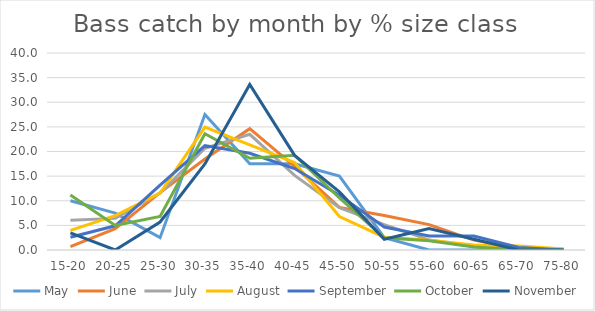
| Category | May | June | July | August | September | October | November |
|---|---|---|---|---|---|---|---|
| 15-20 | 10 | 0.666 | 6.033 | 3.992 | 2.584 | 11.18 | 3.493 |
| 20-25 | 7.5 | 4.326 | 6.418 | 6.986 | 4.91 | 4.969 | 0 |
| 25-30 | 2.5 | 11.647 | 11.553 | 11.577 | 13.178 | 6.832 | 5.677 |
| 30-35 | 27.5 | 18.469 | 20.668 | 24.95 | 21.189 | 23.602 | 17.467 |
| 35-40 | 17.5 | 24.626 | 23.492 | 21.357 | 19.638 | 18.634 | 33.624 |
| 40-45 | 17.5 | 16.972 | 15.148 | 17.764 | 16.537 | 19.255 | 19.214 |
| 45-50 | 15 | 8.652 | 8.601 | 6.786 | 11.111 | 10.559 | 11.79 |
| 50-55 | 2.5 | 6.988 | 5.135 | 2.595 | 4.651 | 2.484 | 2.183 |
| 55-60 | 0 | 5.158 | 2.054 | 1.996 | 2.842 | 1.863 | 4.367 |
| 60-65 | 0 | 1.997 | 0.77 | 0.998 | 2.842 | 0.621 | 2.183 |
| 65-70 | 0 | 0.333 | 0.128 | 0.798 | 0.517 | 0 | 0 |
| 75-80 | 0 | 0.166 | 0 | 0.2 | 0 | 0 | 0 |